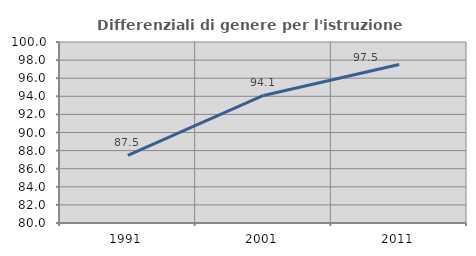
| Category | Differenziali di genere per l'istruzione superiore |
|---|---|
| 1991.0 | 87.471 |
| 2001.0 | 94.097 |
| 2011.0 | 97.518 |